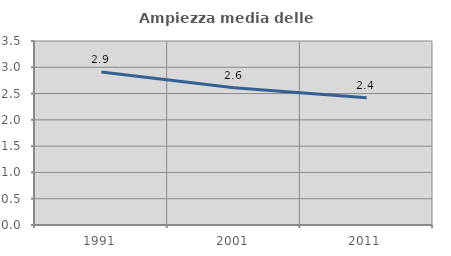
| Category | Ampiezza media delle famiglie |
|---|---|
| 1991.0 | 2.908 |
| 2001.0 | 2.609 |
| 2011.0 | 2.42 |